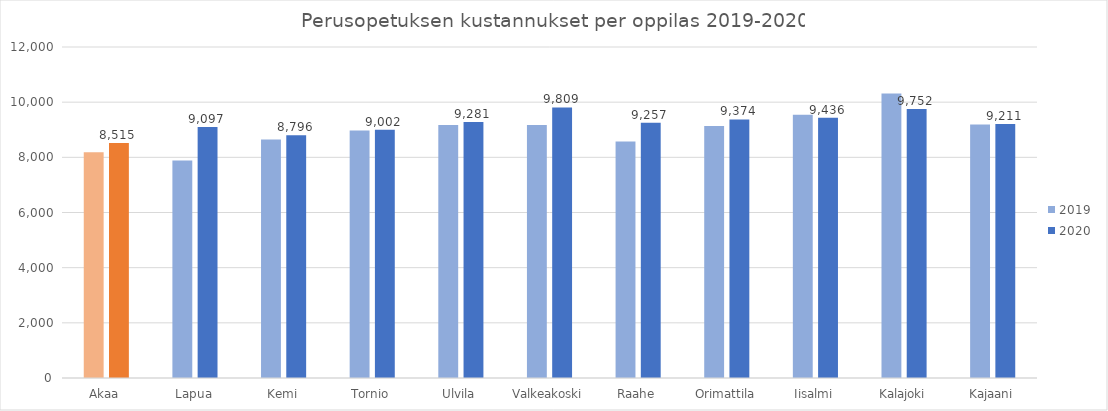
| Category | 2019 | 2020 |
|---|---|---|
| Akaa | 8181.961 | 8515.12 |
| Lapua | 7881.113 | 9096.527 |
| Kemi | 8650.614 | 8796.366 |
| Tornio | 8969.377 | 9002.136 |
| Ulvila | 9173.793 | 9280.775 |
| Valkeakoski | 9168.295 | 9808.867 |
| Raahe | 8573.527 | 9257.479 |
| Orimattila | 9134.585 | 9373.913 |
| Iisalmi | 9546.964 | 9435.861 |
| Kalajoki | 10313.342 | 9751.519 |
| Kajaani | 9193.048 | 9210.827 |